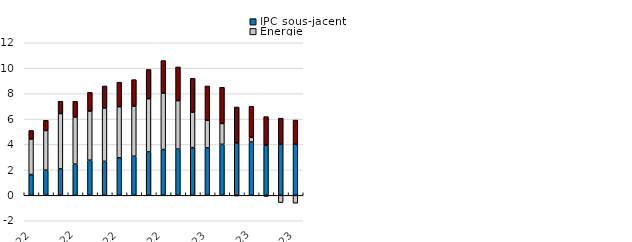
| Category | IPC sous-jacent | Énergie | Produits alimentaires |
|---|---|---|---|
| 2022-01-01 | 1.63 | 2.8 | 0.67 |
| 2022-02-01 | 1.98 | 3.12 | 0.8 |
| 2022-03-01 | 2.08 | 4.35 | 0.97 |
| 2022-04-01 | 2.45 | 3.7 | 1.25 |
| 2022-05-01 | 2.76 | 3.87 | 1.47 |
| 2022-06-01 | 2.67 | 4.19 | 1.74 |
| 2022-07-01 | 2.95 | 4.02 | 1.93 |
| 2022-08-01 | 3.07 | 3.95 | 2.08 |
| 2022-09-01 | 3.41 | 4.19 | 2.3 |
| 2022-10-01 | 3.6 | 4.44 | 2.56 |
| 2022-11-01 | 3.63 | 3.82 | 2.65 |
| 2022-12-01 | 3.75 | 2.79 | 2.66 |
| 2023-01-01 | 3.73 | 2.17 | 2.7 |
| 2023-02-01 | 4.01 | 1.64 | 2.85 |
| 2023-03-01 | 4.13 | -0.05 | 2.82 |
| 2023-04-01 | 4.19 | 0.37 | 2.44 |
| 2023-05-01 | 3.95 | -0.09 | 2.24 |
| 2023-06-01 | 4.02 | -0.57 | 2.05 |
| 2023-07-01 | 4.02 | -0.62 | 1.9 |